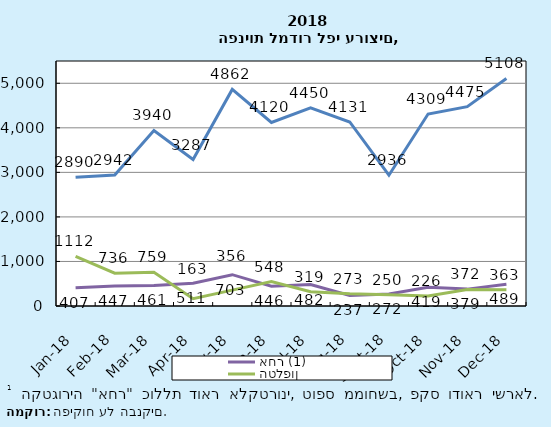
| Category | אחר (1) | הטלפון | האתר האישי |
|---|---|---|---|
| 2018-01-01 | 407 | 1112 | 2890 |
| 2018-02-01 | 447 | 736 | 2942 |
| 2018-03-01 | 461 | 759 | 3940 |
| 2018-04-01 | 511 | 163 | 3287 |
| 2018-05-01 | 703 | 356 | 4862 |
| 2018-06-01 | 446 | 548 | 4120 |
| 2018-07-01 | 482 | 319 | 4450 |
| 2018-08-01 | 237 | 273 | 4131 |
| 2018-09-01 | 272 | 250 | 2936 |
| 2018-10-01 | 419 | 226 | 4309 |
| 2018-11-01 | 379 | 372 | 4475 |
| 2018-12-01 | 489 | 363 | 5108 |